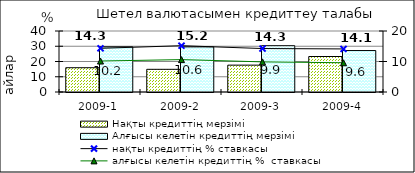
| Category | Нақты кредиттің мерзімі  | Алғысы келетін кредиттің мерзімі  |
|---|---|---|
| 2009-1 | 15.93 | 29.65 |
| 2009-2 | 14.87 | 29.6 |
| 2009-3 | 17.62 | 30.36 |
| 2009-4 | 23.27 | 27.19 |